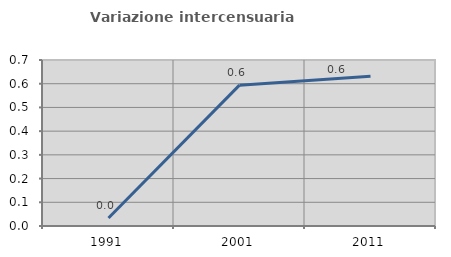
| Category | Variazione intercensuaria annua |
|---|---|
| 1991.0 | 0.034 |
| 2001.0 | 0.594 |
| 2011.0 | 0.631 |